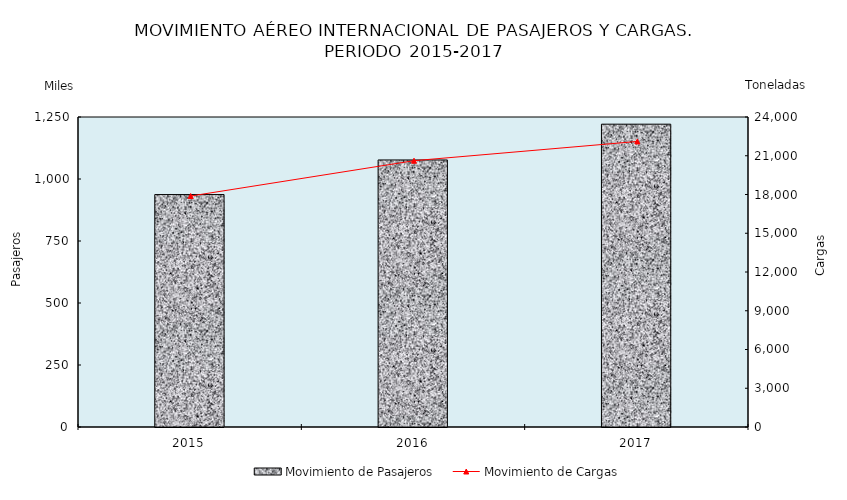
| Category | Movimiento de Pasajeros |
|---|---|
| 2015.0 | 937.214 |
| 2016.0 | 1076.79 |
| 2017.0 | 1221.034 |